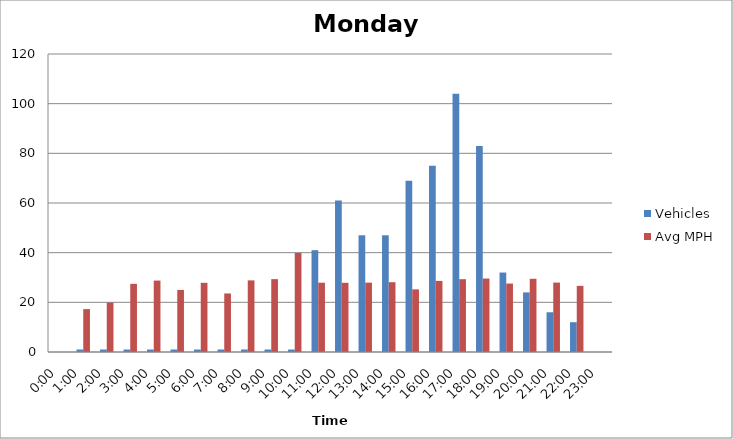
| Category | Vehicles | Avg MPH |
|---|---|---|
| 0:00 | 0 | 0 |
| 1:00 | 1 | 17.27 |
| 2:00 | 1 | 19.92 |
| 3:00 | 1 | 27.45 |
| 4:00 | 1 | 28.76 |
| 5:00 | 1 | 24.99 |
| 6:00 | 1 | 27.86 |
| 7:00 | 1 | 23.57 |
| 8:00 | 1 | 28.84 |
| 9:00 | 1 | 29.34 |
| 10:00 | 1 | 39.86 |
| 11:00 | 41 | 27.9 |
| 12:00 | 61 | 27.86 |
| 13:00 | 47 | 27.93 |
| 14:00 | 47 | 28.11 |
| 15:00 | 69 | 25.22 |
| 16:00 | 75 | 28.63 |
| 17:00 | 104 | 29.32 |
| 18:00 | 83 | 29.58 |
| 19:00 | 32 | 27.56 |
| 20:00 | 24 | 29.48 |
| 21:00 | 16 | 27.95 |
| 22:00 | 12 | 26.63 |
| 23:00 | 0 | 0 |